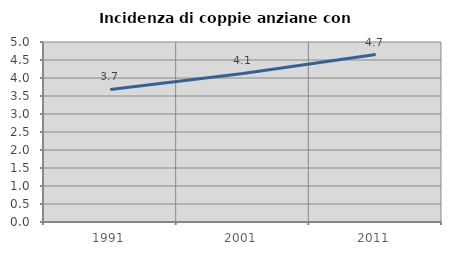
| Category | Incidenza di coppie anziane con figli |
|---|---|
| 1991.0 | 3.683 |
| 2001.0 | 4.128 |
| 2011.0 | 4.651 |